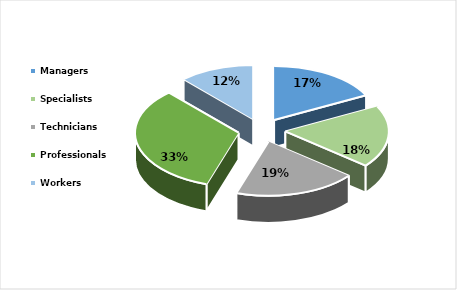
| Category | Series 0 |
|---|---|
| Managers | 0.174 |
| Specialists | 0.185 |
| Technicians | 0.191 |
| Professionals | 0.333 |
| Workers  | 0.117 |